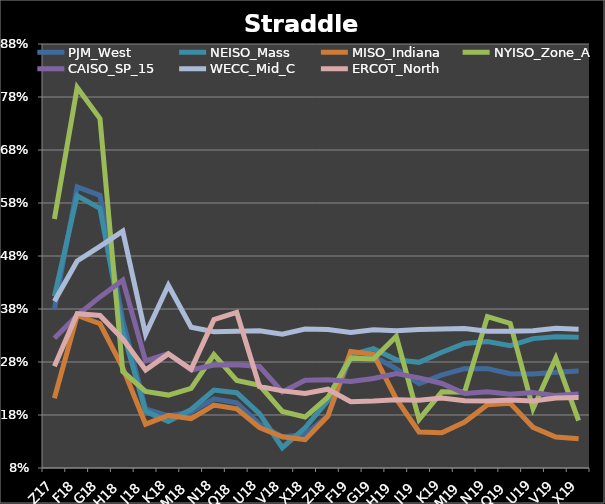
| Category | PJM_West | NEISO_Mass | MISO_Indiana | NYISO_Zone_A | CAISO_SP_15 | WECC_Mid_C | ERCOT_North |
|---|---|---|---|---|---|---|---|
| Z17 | 0.379 | 0.404 | 0.212 | 0.55 | 0.325 | 0.394 | 0.272 |
| F18 | 0.61 | 0.594 | 0.368 | 0.798 | 0.368 | 0.471 | 0.371 |
| G18 | 0.594 | 0.57 | 0.352 | 0.739 | 0.403 | 0.498 | 0.368 |
| H18 | 0.359 | 0.338 | 0.269 | 0.262 | 0.434 | 0.527 | 0.324 |
| J18 | 0.192 | 0.187 | 0.163 | 0.224 | 0.282 | 0.332 | 0.265 |
| K18 | 0.178 | 0.168 | 0.179 | 0.218 | 0.296 | 0.425 | 0.295 |
| M18 | 0.186 | 0.19 | 0.173 | 0.23 | 0.265 | 0.346 | 0.266 |
| N18 | 0.21 | 0.227 | 0.199 | 0.294 | 0.274 | 0.337 | 0.36 |
| Q18 | 0.203 | 0.222 | 0.192 | 0.245 | 0.275 | 0.338 | 0.374 |
| U18 | 0.163 | 0.182 | 0.156 | 0.236 | 0.272 | 0.339 | 0.234 |
| V18 | 0.138 | 0.118 | 0.139 | 0.187 | 0.224 | 0.333 | 0.226 |
| X18 | 0.143 | 0.156 | 0.134 | 0.176 | 0.245 | 0.342 | 0.221 |
| Z18 | 0.179 | 0.207 | 0.178 | 0.214 | 0.246 | 0.341 | 0.229 |
| F19 | 0.29 | 0.294 | 0.3 | 0.287 | 0.243 | 0.336 | 0.205 |
| G19 | 0.291 | 0.305 | 0.294 | 0.286 | 0.249 | 0.341 | 0.206 |
| H19 | 0.267 | 0.284 | 0.21 | 0.328 | 0.258 | 0.339 | 0.209 |
| J19 | 0.239 | 0.279 | 0.148 | 0.172 | 0.25 | 0.341 | 0.208 |
| K19 | 0.256 | 0.298 | 0.146 | 0.224 | 0.24 | 0.342 | 0.212 |
| M19 | 0.267 | 0.315 | 0.167 | 0.224 | 0.221 | 0.343 | 0.207 |
| N19 | 0.267 | 0.318 | 0.199 | 0.366 | 0.224 | 0.338 | 0.207 |
| Q19 | 0.258 | 0.311 | 0.202 | 0.353 | 0.219 | 0.338 | 0.208 |
| U19 | 0.257 | 0.324 | 0.157 | 0.192 | 0.223 | 0.339 | 0.206 |
| V19 | 0.261 | 0.327 | 0.138 | 0.287 | 0.217 | 0.343 | 0.212 |
| X19 | 0.263 | 0.327 | 0.135 | 0.169 | 0.22 | 0.342 | 0.213 |